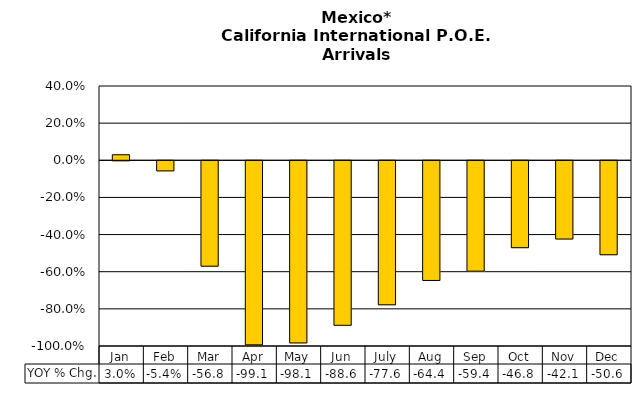
| Category | YOY % Chg. |
|---|---|
| Jan | 0.03 |
| Feb | -0.054 |
| Mar | -0.568 |
| Apr | -0.991 |
| May | -0.981 |
| Jun | -0.886 |
| July | -0.776 |
| Aug | -0.644 |
| Sep | -0.594 |
| Oct | -0.468 |
| Nov | -0.421 |
| Dec | -0.506 |